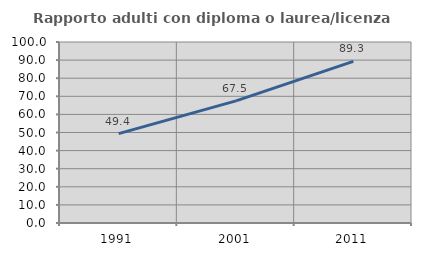
| Category | Rapporto adulti con diploma o laurea/licenza media  |
|---|---|
| 1991.0 | 49.39 |
| 2001.0 | 67.474 |
| 2011.0 | 89.318 |